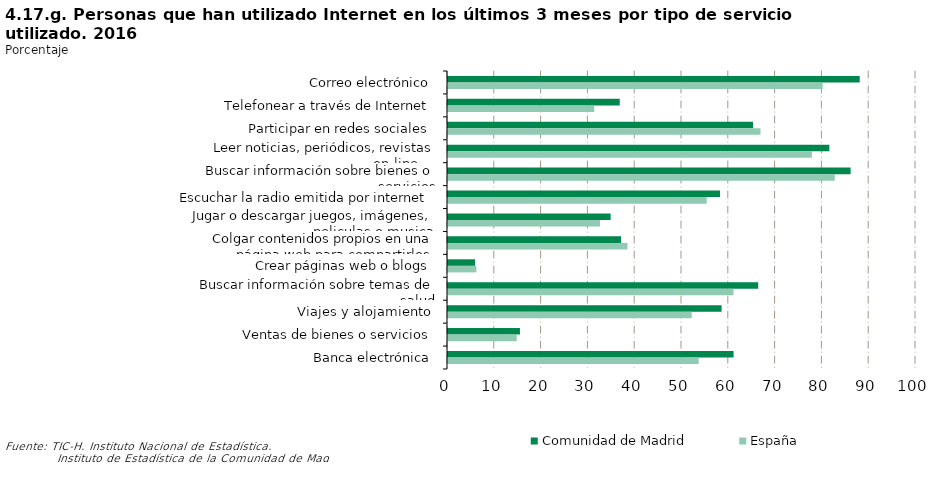
| Category | Comunidad de Madrid | España |
|---|---|---|
| Correo electrónico | 87.967 | 80.059 |
| Telefonear a través de Internet | 36.701 | 31.249 |
| Participar en redes sociales | 65.176 | 66.771 |
| Leer noticias, periódicos, revistas on-line,… | 81.489 | 77.748 |
| Buscar información sobre bienes o servicios | 86.027 | 82.643 |
| Escuchar la radio emitida por internet | 58.13 | 55.276 |
| Jugar o descargar juegos, imágenes, peliculas o musica | 34.752 | 32.477 |
| Colgar contenidos propios en una página web para compartirlos | 36.987 | 38.352 |
| Crear páginas web o blogs | 5.789 | 6.074 |
| Buscar información sobre temas de salud | 66.283 | 61.002 |
| Viajes y alojamiento | 58.458 | 52.076 |
| Ventas de bienes o servicios | 15.372 | 14.679 |
| Banca electrónica | 61.027 | 53.559 |